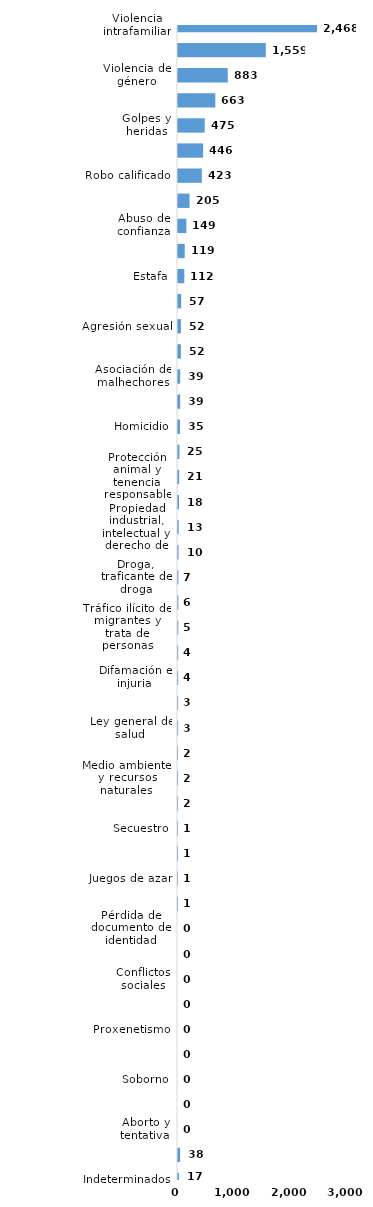
| Category | Series 0 |
|---|---|
| Violencia intrafamiliar | 2468 |
| Código del menor NNA | 1559 |
| Violencia de género | 883 |
| Amenaza | 663 |
| Golpes y heridas | 475 |
| Crímenes y delitos de alta tecnología | 446 |
| Robo calificado | 423 |
| Daños y perjuicios a la cosa ajena | 205 |
| Abuso de confianza | 149 |
| Código de trabajo | 119 |
| Estafa | 112 |
| Ley de armas | 57 |
| Agresión sexual | 52 |
| Falsificación | 52 |
| Asociación de malhechores | 39 |
| Droga, distribución de droga | 39 |
| Homicidio | 35 |
| Droga, sanciones y circunstancias agravantes | 25 |
| Protección animal y tenencia responsable | 21 |
| Violación sexual | 18 |
| Propiedad industrial, intelectual y derecho de autor | 13 |
| Tentativa de homicidio | 10 |
| Droga, traficante de droga | 7 |
| Crímenes y delitos contra la propiedad | 6 |
| Tráfico ilícito de migrantes y trata de personas | 5 |
| Robo simple | 4 |
| Difamación e injuria | 4 |
| Tránsito y seguridad vial  | 3 |
| Ley general de salud | 3 |
| Droga, simple posesión | 2 |
| Medio ambiente y recursos naturales | 2 |
| Ley de cheques | 2 |
| Secuestro | 1 |
| Contra el lavado de activos  | 1 |
| Juegos de azar | 1 |
| Droga, delitos y sanciones | 1 |
| Pérdida de documento de identidad | 0 |
| Desaparición | 0 |
| Conflictos sociales | 0 |
| Derechos humanos | 0 |
| Proxenetismo | 0 |
| Terrorismo | 0 |
| Soborno | 0 |
| Prevaricación | 0 |
| Aborto y tentativa | 0 |
| Otros | 38 |
| Indeterminados | 17 |